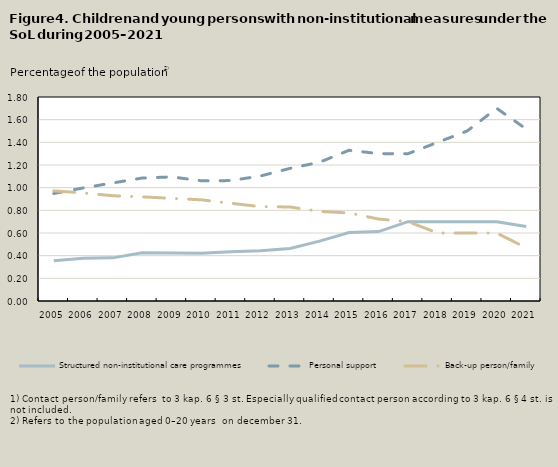
| Category | Structured non-institutional care programmes | Personal support | Back-up person/family |
|---|---|---|---|
| 2005.0 | 0.356 | 0.949 | 0.972 |
| 2006.0 | 0.376 | 0.998 | 0.954 |
| 2007.0 | 0.381 | 1.042 | 0.929 |
| 2008.0 | 0.426 | 1.085 | 0.919 |
| 2009.0 | 0.425 | 1.095 | 0.905 |
| 2010.0 | 0.421 | 1.061 | 0.893 |
| 2011.0 | 0.435 | 1.062 | 0.862 |
| 2012.0 | 0.443 | 1.103 | 0.833 |
| 2013.0 | 0.463 | 1.17 | 0.83 |
| 2014.0 | 0.528 | 1.224 | 0.79 |
| 2015.0 | 0.604 | 1.33 | 0.777 |
| 2016.0 | 0.613 | 1.3 | 0.723 |
| 2017.0 | 0.7 | 1.3 | 0.7 |
| 2018.0 | 0.7 | 1.4 | 0.6 |
| 2019.0 | 0.7 | 1.5 | 0.6 |
| 2020.0 | 0.7 | 1.7 | 0.6 |
| 2021.0 | 0.657 | 1.518 | 0.468 |